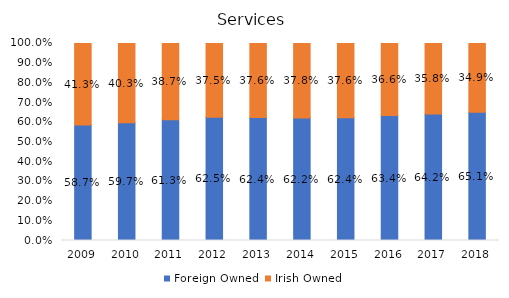
| Category | Foreign Owned | Irish Owned |
|---|---|---|
| 2009.0 | 0.587 | 0.413 |
| 2010.0 | 0.597 | 0.403 |
| 2011.0 | 0.613 | 0.387 |
| 2012.0 | 0.625 | 0.375 |
| 2013.0 | 0.624 | 0.376 |
| 2014.0 | 0.622 | 0.378 |
| 2015.0 | 0.624 | 0.376 |
| 2016.0 | 0.634 | 0.366 |
| 2017.0 | 0.642 | 0.358 |
| 2018.0 | 0.651 | 0.349 |